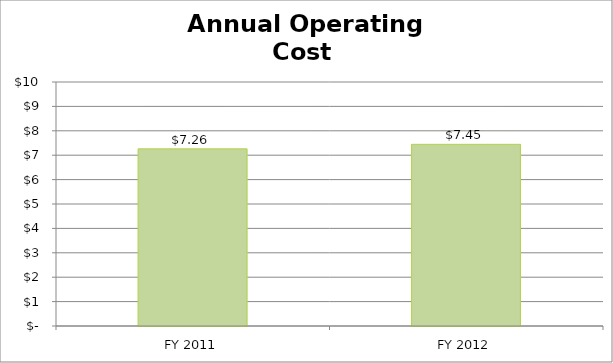
| Category | Series 0 |
|---|---|
| FY 2011 | 7.261 |
| FY 2012 | 7.445 |